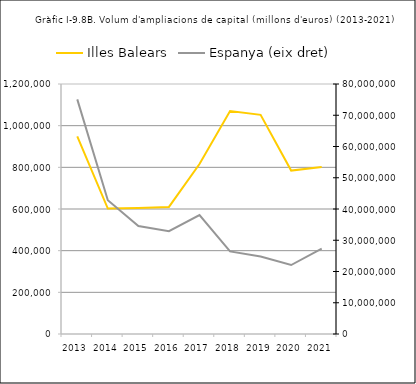
| Category | Illes Balears |
|---|---|
| 2013.0 | 948624 |
| 2014.0 | 602148 |
| 2015.0 | 604621 |
| 2016.0 | 610044 |
| 2017.0 | 816078 |
| 2018.0 | 1070113 |
| 2019.0 | 1051851 |
| 2020.0 | 784329 |
| 2021.0 | 801468 |